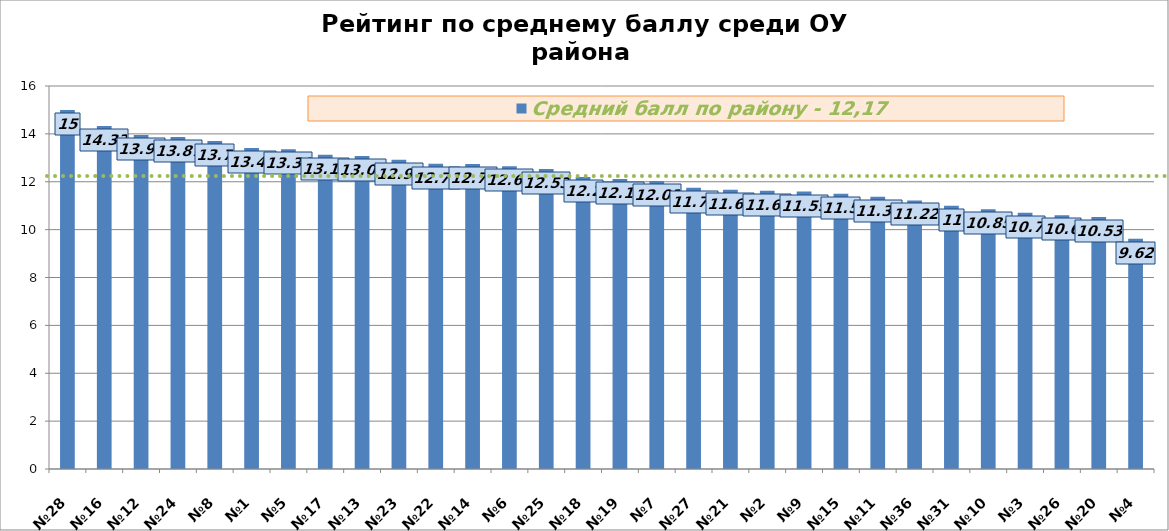
| Category | Средний балл по району - 12,17 |
|---|---|
| №28 | 15 |
| №16 | 14.33 |
| №12 | 13.95 |
| №24 | 13.87 |
| №8 | 13.7 |
| №1 | 13.41 |
| №5 | 13.36 |
| №17 | 13.13 |
| №13 | 13.08 |
| №23 | 12.92 |
| №22 | 12.75 |
| №14 | 12.74 |
| №6 | 12.65 |
| №25 | 12.53 |
| №18 | 12.2 |
| №19 | 12.12 |
| №7 | 12.03 |
| №27 | 11.75 |
| №21 | 11.67 |
| №2 | 11.62 |
| №9 | 11.59 |
| №15 | 11.5 |
| №11 | 11.37 |
| №36 | 11.22 |
| №31 | 11 |
| №10 | 10.85 |
| №3 | 10.7 |
| №26 | 10.6 |
| №20 | 10.53 |
| №4 | 9.62 |